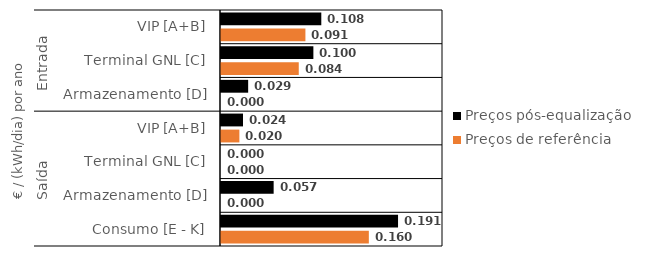
| Category | Preços pós-equalização | Preços de referência |
|---|---|---|
| 0 | 0.108 | 0.091 |
| 1 | 0.1 | 0.084 |
| 2 | 0.029 | 0 |
| 3 | 0.024 | 0.02 |
| 4 | 0 | 0 |
| 5 | 0.057 | 0 |
| 6 | 0.191 | 0.16 |